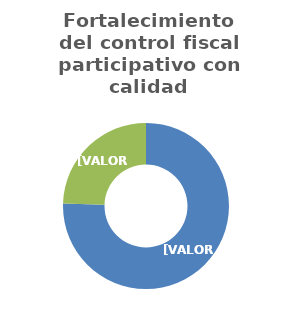
| Category | Fortalecimiento del control fiscal participativo con calidad |
|---|---|
| Avance 1° Semestre
(ejecución acumulada a junio de 2020) | 0.755 |
| Diferencia
(ejecución faltante para completar la meta establecida) | 0.245 |